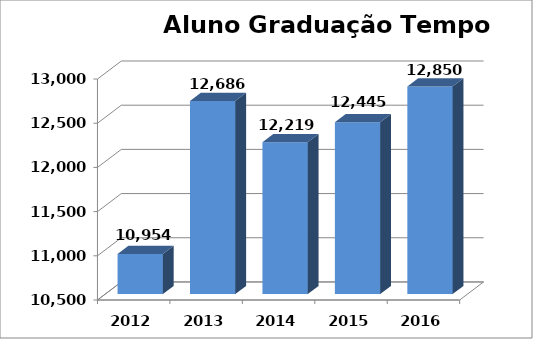
| Category | Series 0 |
|---|---|
| 2012.0 | 10953.92 |
| 2013.0 | 12686.11 |
| 2014.0 | 12218.531 |
| 2015.0 | 12445.014 |
| 2016.0 | 12850.156 |